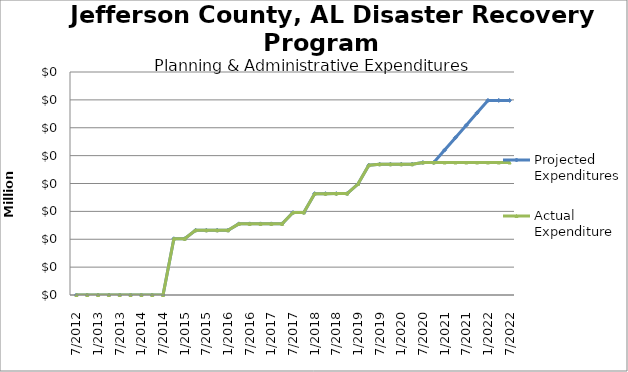
| Category | Projected Expenditures | Actual Expenditure |
|---|---|---|
| 7/2012 | 0 | 0 |
| 10/2012 | 0 | 0 |
| 1/2013 | 0 | 0 |
| 4/2013 | 0 | 0 |
| 7/2013 | 0 | 0 |
| 10/2013 | 0 | 0 |
| 1/2014 | 0 | 0 |
| 4/2014 | 0 | 0 |
| 7/2014 | 0 | 0 |
| 10/2014 | 100845 | 100845.15 |
| 1/2015 | 100845 | 100845.15 |
| 4/2015 | 116108 | 116107.98 |
| 7/2015 | 116108 | 116107.98 |
| 10/2015 | 116108 | 116107.98 |
| 1/2016 | 116108 | 116107.98 |
| 4/2016 | 127613 | 127613.46 |
| 7/2016 | 127613 | 127613.46 |
| 10/2016 | 127613 | 127613.46 |
| 1/2017 | 127613 | 127613.46 |
| 4/2017 | 127613 | 127613.46 |
| 7/2017 | 147953 | 147953.95 |
| 10/2017 | 147953 | 147953.95 |
| 1/2018 | 181801 | 181801.74 |
| 4/2018 | 181801 | 181801.74 |
| 7/2018 | 181880 | 181880.94 |
| 10/2018 | 181880 | 181880.94 |
| 1/2019 | 199060.06 | 199061 |
| 4/2019 | 232764.04 | 232764.98 |
| 7/2019 | 234573.98 | 234574.92 |
| 10/2019 | 234573.98 | 234574.92 |
| 1/2020 | 234573.98 | 234574.92 |
| 4/2020 | 234573.98 | 234574.92 |
| 7/2020 | 237625.95 | 237626.89 |
| 10/2020 | 237625.95 | 237626.89 |
| 1/2021 | 259912.75 | 237626.89 |
| 4/2021 | 282199.55 | 237626.89 |
| 7/2021 | 304486.35 | 237626.89 |
| 10/2021 | 326773.15 | 237626.89 |
| 1/2022 | 349059.95 | 237626.89 |
| 4/2022 | 349059.95 | 237626.89 |
| 7/2022 | 349059.95 | 237626.89 |